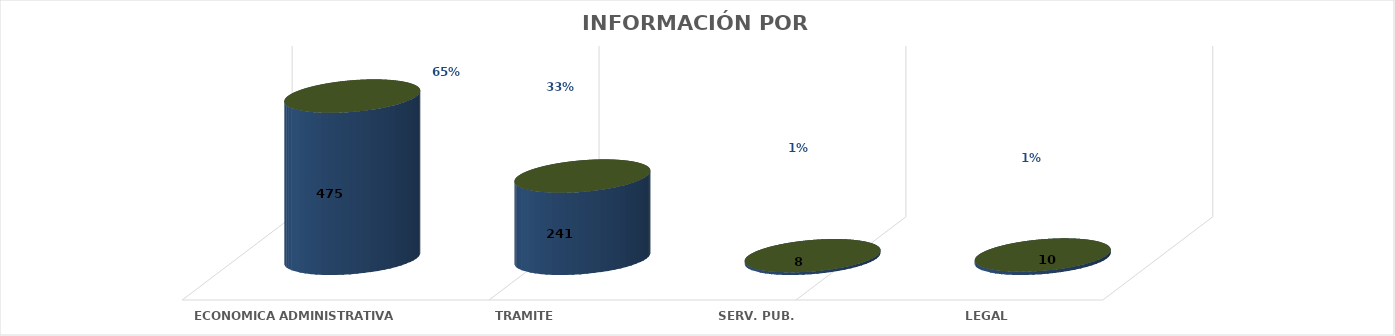
| Category | Series 0 | Series 1 | Series 2 | Series 3 | Series 4 |
|---|---|---|---|---|---|
| ECONOMICA ADMINISTRATIVA |  |  |  | 475 | 0.647 |
| TRAMITE |  |  |  | 241 | 0.328 |
| SERV. PUB. |  |  |  | 8 | 0.011 |
| LEGAL |  |  |  | 10 | 0.014 |